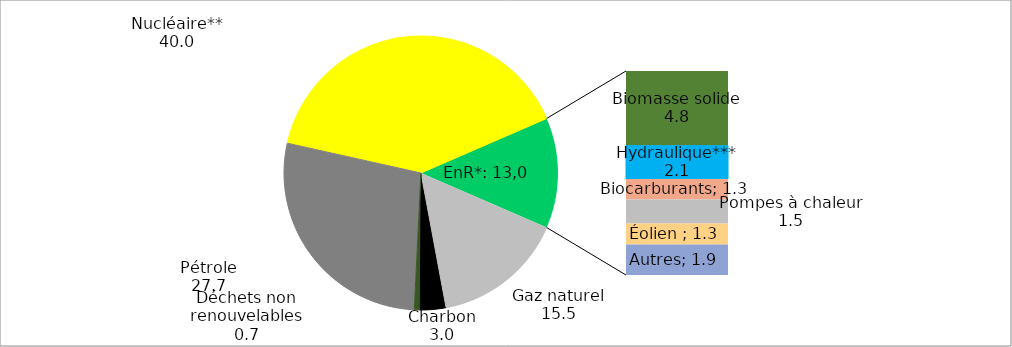
| Category | Mix énergétique primaire |
|---|---|
| Gaz naturel | 15.546 |
| Charbon | 3.014 |
| Déchets non renouvelables | 0.705 |
| Pétrole | 27.71 |
| Nucléaire** | 39.991 |
| Biomasse solide | 4.771 |
| Hydraulique*** | 2.126 |
| Biocarburants | 1.307 |
| Pompes à chaleur | 1.546 |
| Éolien  | 1.337 |
| Autres | 1.948 |